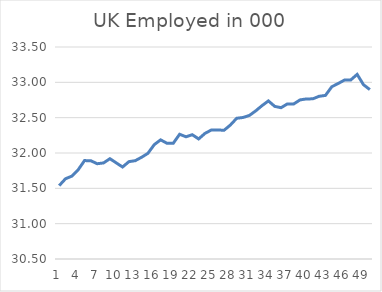
| Category | Employed |
|---|---|
| 0 | 31.538 |
| 1 | 31.636 |
| 2 | 31.673 |
| 3 | 31.763 |
| 4 | 31.893 |
| 5 | 31.89 |
| 6 | 31.848 |
| 7 | 31.859 |
| 8 | 31.92 |
| 9 | 31.86 |
| 10 | 31.802 |
| 11 | 31.878 |
| 12 | 31.891 |
| 13 | 31.94 |
| 14 | 31.996 |
| 15 | 32.118 |
| 16 | 32.186 |
| 17 | 32.138 |
| 18 | 32.138 |
| 19 | 32.265 |
| 20 | 32.23 |
| 21 | 32.259 |
| 22 | 32.199 |
| 23 | 32.277 |
| 24 | 32.325 |
| 25 | 32.326 |
| 26 | 32.321 |
| 27 | 32.395 |
| 28 | 32.491 |
| 29 | 32.503 |
| 30 | 32.531 |
| 31 | 32.596 |
| 32 | 32.671 |
| 33 | 32.737 |
| 34 | 32.66 |
| 35 | 32.641 |
| 36 | 32.695 |
| 37 | 32.695 |
| 38 | 32.752 |
| 39 | 32.765 |
| 40 | 32.766 |
| 41 | 32.802 |
| 42 | 32.815 |
| 43 | 32.938 |
| 44 | 32.983 |
| 45 | 33.032 |
| 46 | 33.034 |
| 47 | 33.113 |
| 48 | 32.967 |
| 49 | 32.897 |